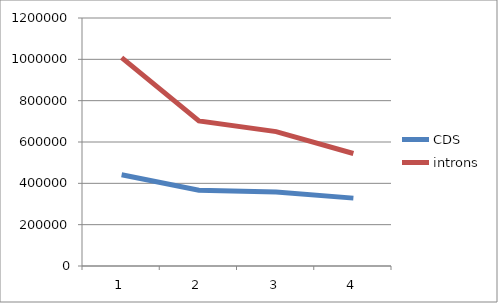
| Category | CDS | introns |
|---|---|---|
| 0 | 441597 | 1008090 |
| 1 | 366941 | 702194 |
| 2 | 357487 | 650089 |
| 3 | 328419 | 544246 |